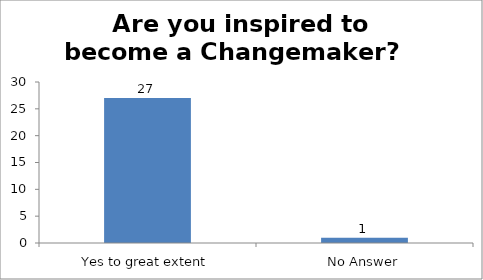
| Category | Are you inspired to become a Changemaker?   |
|---|---|
| Yes to great extent | 27 |
| No Answer | 1 |